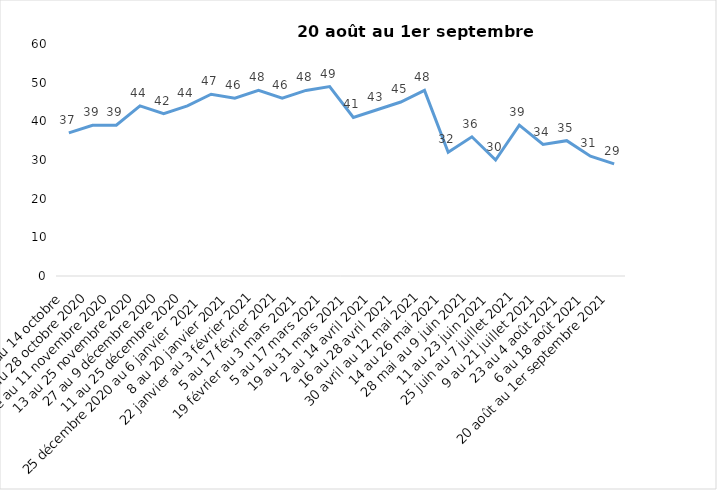
| Category | Toujours aux trois mesures |
|---|---|
| 2 au 14 octobre  | 37 |
| 16 au 28 octobre 2020 | 39 |
| 30 octobre au 11 novembre 2020 | 39 |
| 13 au 25 novembre 2020 | 44 |
| 27 au 9 décembre 2020 | 42 |
| 11 au 25 décembre 2020 | 44 |
| 25 décembre 2020 au 6 janvier  2021 | 47 |
| 8 au 20 janvier 2021 | 46 |
| 22 janvier au 3 février 2021 | 48 |
| 5 au 17 février 2021 | 46 |
| 19 février au 3 mars 2021 | 48 |
| 5 au 17 mars 2021 | 49 |
| 19 au 31 mars 2021 | 41 |
| 2 au 14 avril 2021 | 43 |
| 16 au 28 avril 2021 | 45 |
| 30 avril au 12 mai 2021 | 48 |
| 14 au 26 mai 2021 | 32 |
| 28 mai au 9 juin 2021 | 36 |
| 11 au 23 juin 2021 | 30 |
| 25 juin au 7 juillet 2021 | 39 |
| 9 au 21 juillet 2021 | 34 |
| 23 au 4 août 2021 | 35 |
| 6 au 18 août 2021 | 31 |
| 20 août au 1er septembre 2021 | 29 |